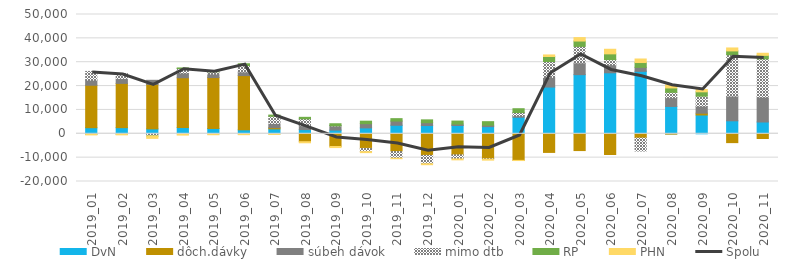
| Category | DvN | dôch.dávky | súbeh dávok | mimo dtb | RP | PHN |
|---|---|---|---|---|---|---|
| 2019_01 | 2550 | 17793 | 2153 | 3642 | -253 | -215 |
| 2019_02 | 2569 | 18555 | 2087 | 2044 | -149 | -296 |
| 2019_03 | 2057 | 18653 | 1710 | -865 | -43 | -1015 |
| 2019_04 | 2617 | 20868 | 2000 | 1868 | 248 | -542 |
| 2019_05 | 2231 | 21324 | 1513 | 908 | 438 | -396 |
| 2019_06 | 1671 | 22721 | 1578 | 2637 | 743 | -372 |
| 2019_07 | 2062 | 484 | 1810 | 3004 | 479 | -279 |
| 2019_08 | 1760 | -3324 | 1663 | 2847 | 628 | -450 |
| 2019_09 | 1548 | -5330 | 1792 | 17 | 852 | -443 |
| 2019_10 | 2467 | -6143 | 1769 | -1338 | 1047 | -416 |
| 2019_11 | 3568 | -7466 | 1761 | -2745 | 1018 | -238 |
| 2019_12 | 3456 | -9056 | 1185 | -3505 | 1198 | -400 |
| 2020_01 | 3469 | -8844 | 589 | -1693 | 1268 | -387 |
| 2020_02 | 2990 | -10480 | 612 | -160 | 1478 | -403 |
| 2020_03 | 6945 | -11145 | 632 | 1337 | 1593 | -74 |
| 2020_04 | 19585 | -7811 | 4051 | 6648 | 2122 | 644 |
| 2020_05 | 24785 | -7034 | 4980 | 6862 | 2250 | 1440 |
| 2020_06 | 25565 | -8675 | 3378 | 2148 | 2411 | 1928 |
| 2020_07 | 26181 | -1813 | 1669 | -5397 | 2014 | 1487 |
| 2020_08 | 11463 | -133 | 3682 | 2238 | 1836 | 1253 |
| 2020_09 | 7878 | 750 | 2969 | 4165 | 1831 | 967 |
| 2020_10 | 5440 | -3704 | 10390 | 17303 | 1601 | 1242 |
| 2020_11 | 4944 | -1974 | 10438 | 16019 | 1476 | 879 |